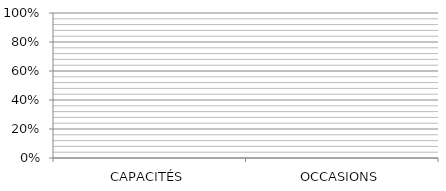
| Category | Series 0 | Series 1 | Series 2 | Series 3 |
|---|---|---|---|---|
| CAPACITÉS | 0 | 0 | 0 | 0 |
| OCCASIONS | 0 | 0 | 0 | 0 |